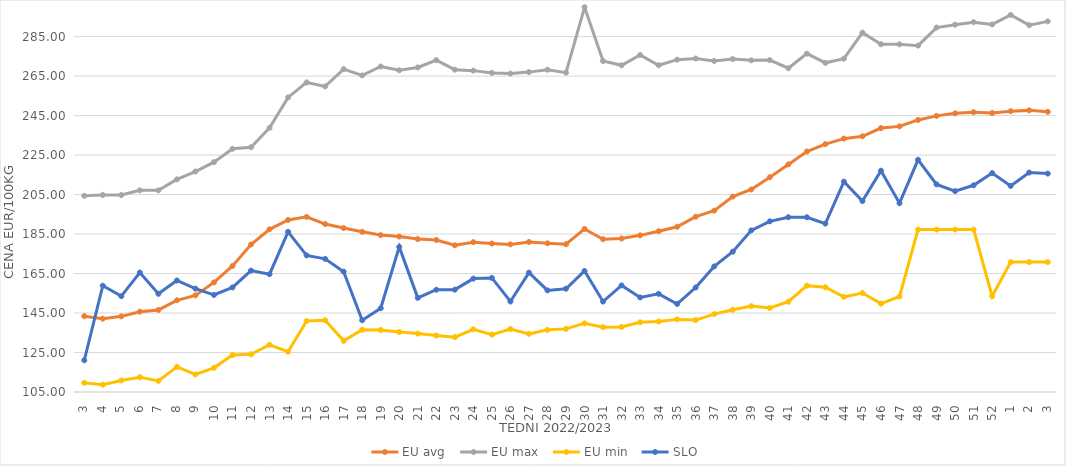
| Category | EU avg | EU max | EU min | SLO |
|---|---|---|---|---|
| 3.0 | 143.402 | 204.34 | 109.62 | 121.07 |
| 4.0 | 142.134 | 204.76 | 108.71 | 158.82 |
| 5.0 | 143.314 | 204.76 | 110.86 | 153.55 |
| 6.0 | 145.677 | 207.14 | 112.52 | 165.51 |
| 7.0 | 146.556 | 207.14 | 110.619 | 154.74 |
| 8.0 | 151.439 | 212.7 | 117.709 | 161.48 |
| 9.0 | 153.947 | 216.67 | 113.871 | 157.38 |
| 10.0 | 160.496 | 221.43 | 117.233 | 154.16 |
| 11.0 | 168.845 | 228.17 | 123.737 | 157.96 |
| 12.0 | 179.714 | 228.97 | 124.105 | 166.49 |
| 13.0 | 187.409 | 238.81 | 128.918 | 164.66 |
| 14.0 | 192.137 | 254.21 | 125.399 | 186.11 |
| 15.0 | 193.697 | 261.79 | 140.954 | 174.18 |
| 16.0 | 190.066 | 259.76 | 141.337 | 172.42 |
| 17.0 | 188.031 | 268.52 | 130.897 | 165.96 |
| 18.0 | 186.119 | 265.34 | 136.529 | 141.36 |
| 19.0 | 184.47 | 269.87 | 136.387 | 147.43 |
| 20.0 | 183.734 | 267.92 | 135.392 | 178.51 |
| 21.0 | 182.45 | 269.38 | 134.589 | 152.67 |
| 22.0 | 181.991 | 273.06 | 133.621 | 156.8 |
| 23.0 | 179.308 | 268.27 | 132.787 | 156.84 |
| 24.0 | 180.886 | 267.77 | 136.75 | 162.44 |
| 25.0 | 180.2 | 266.63 | 134.058 | 162.78 |
| 26.0 | 179.77 | 266.27 | 136.895 | 150.82 |
| 27.0 | 180.992 | 267.02 | 134.44 | 165.45 |
| 28.0 | 180.305 | 268.25 | 136.486 | 156.46 |
| 29.0 | 179.847 | 266.77 | 136.97 | 157.31 |
| 30.0 | 187.576 | 299.87 | 139.777 | 166.29 |
| 31.0 | 182.385 | 272.64 | 137.828 | 150.81 |
| 32.0 | 182.73 | 270.47 | 137.934 | 158.99 |
| 33.0 | 184.343 | 275.68 | 140.33 | 152.91 |
| 34.0 | 186.448 | 270.49 | 140.7 | 154.73 |
| 35.0 | 188.684 | 273.33 | 141.78 | 149.6 |
| 36.0 | 193.792 | 273.91 | 141.41 | 157.93 |
| 37.0 | 196.877 | 272.67 | 144.47 | 168.61 |
| 38.0 | 203.962 | 273.63 | 146.68 | 176.07 |
| 39.0 | 207.574 | 272.98 | 148.499 | 186.86 |
| 40.0 | 213.785 | 273.1 | 147.54 | 191.45 |
| 41.0 | 220.272 | 268.98 | 150.75 | 193.52 |
| 42.0 | 226.803 | 276.39 | 158.87 | 193.52 |
| 43.0 | 230.521 | 271.72 | 158.04 | 190.28 |
| 44.0 | 233.325 | 273.856 | 153.16 | 211.53 |
| 45.0 | 234.517 | 287.021 | 155.13 | 201.69 |
| 46.0 | 238.669 | 281.133 | 149.75 | 217.08 |
| 47.0 | 239.534 | 281.102 | 153.36 | 200.62 |
| 48.0 | 242.81 | 280.434 | 187.26 | 222.61 |
| 49.0 | 244.854 | 289.585 | 187.26 | 210.16 |
| 50.0 | 246.132 | 291.057 | 187.26 | 206.76 |
| 51.0 | 246.705 | 292.307 | 187.26 | 209.69 |
| 52.0 | 246.301 | 291.174 | 153.54 | 215.87 |
| 1.0 | 247.242 | 295.98 | 170.79 | 209.37 |
| 2.0 | 247.64 | 290.8 | 170.79 | 216.15 |
| 3.0 | 246.914 | 292.71 | 170.79 | 215.63 |